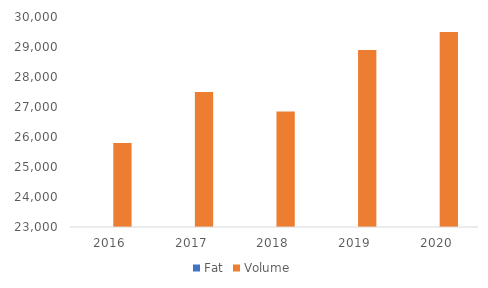
| Category | Fat | Volume |
|---|---|---|
| 2016.0 |  | 25800 |
| 2017.0 |  | 27500 |
| 2018.0 |  | 26850 |
| 2019.0 |  | 28900 |
| 2020.0 |  | 29500 |